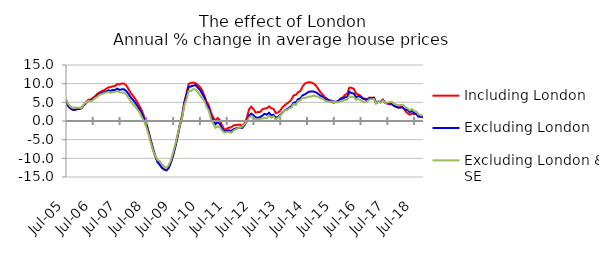
| Category | Including London | Excluding London | Excluding London & SE |
|---|---|---|---|
| 2005-07-01 | 4.929 | 5.234 | 5.912 |
| 2005-08-01 | 3.904 | 4.11 | 4.579 |
| 2005-09-01 | 3.307 | 3.467 | 3.845 |
| 2005-10-01 | 2.983 | 3.057 | 3.504 |
| 2005-11-01 | 2.97 | 3.027 | 3.61 |
| 2005-12-01 | 3.282 | 3.163 | 3.554 |
| 2006-01-01 | 3.392 | 3.23 | 3.526 |
| 2006-02-01 | 3.661 | 3.384 | 3.507 |
| 2006-03-01 | 4.324 | 4.241 | 4.508 |
| 2006-04-01 | 4.937 | 4.745 | 4.889 |
| 2006-05-01 | 5.692 | 5.5 | 5.409 |
| 2006-06-01 | 5.74 | 5.391 | 5.297 |
| 2006-07-01 | 6.189 | 5.833 | 5.562 |
| 2006-08-01 | 6.652 | 6.246 | 6.111 |
| 2006-09-01 | 7.224 | 6.766 | 6.471 |
| 2006-10-01 | 7.66 | 7.279 | 6.993 |
| 2006-11-01 | 7.994 | 7.519 | 7.201 |
| 2006-12-01 | 8.229 | 7.714 | 7.454 |
| 2007-01-01 | 8.608 | 7.898 | 7.611 |
| 2007-02-01 | 9.011 | 8.213 | 7.807 |
| 2007-03-01 | 9.08 | 8.094 | 7.535 |
| 2007-04-01 | 9.295 | 8.304 | 7.716 |
| 2007-05-01 | 9.388 | 8.306 | 7.832 |
| 2007-06-01 | 9.907 | 8.66 | 7.966 |
| 2007-07-01 | 9.788 | 8.343 | 7.697 |
| 2007-08-01 | 10.057 | 8.482 | 7.582 |
| 2007-09-01 | 10.004 | 8.485 | 7.621 |
| 2007-10-01 | 9.547 | 8.05 | 7.097 |
| 2007-11-01 | 8.556 | 7.262 | 6.242 |
| 2007-12-01 | 7.513 | 6.355 | 5.285 |
| 2008-01-01 | 6.804 | 5.702 | 4.489 |
| 2008-02-01 | 5.949 | 4.882 | 3.861 |
| 2008-03-01 | 4.981 | 4.03 | 3.108 |
| 2008-04-01 | 3.926 | 3.04 | 2.268 |
| 2008-05-01 | 2.778 | 1.996 | 1.026 |
| 2008-06-01 | 1.183 | 0.603 | -0.123 |
| 2008-07-01 | -0.603 | -0.964 | -1.66 |
| 2008-08-01 | -2.766 | -3.011 | -3.518 |
| 2008-09-01 | -5.136 | -5.317 | -5.868 |
| 2008-10-01 | -7.399 | -7.61 | -7.927 |
| 2008-11-01 | -9.296 | -9.441 | -9.326 |
| 2008-12-01 | -10.78 | -11.022 | -10.45 |
| 2009-01-01 | -11.611 | -11.692 | -10.714 |
| 2009-02-01 | -12.508 | -12.526 | -11.659 |
| 2009-03-01 | -13.003 | -12.983 | -12.112 |
| 2009-04-01 | -13.206 | -13.181 | -12.62 |
| 2009-05-01 | -12.458 | -12.581 | -11.826 |
| 2009-06-01 | -11.081 | -11.188 | -10.551 |
| 2009-07-01 | -9.049 | -9.241 | -8.491 |
| 2009-08-01 | -6.731 | -6.878 | -6.239 |
| 2009-09-01 | -3.878 | -4.304 | -3.732 |
| 2009-10-01 | -0.95 | -1.35 | -1.078 |
| 2009-11-01 | 1.436 | 0.841 | 0.812 |
| 2009-12-01 | 5.087 | 4.677 | 4.051 |
| 2010-01-01 | 7.476 | 6.847 | 5.855 |
| 2010-02-01 | 9.957 | 9.158 | 8.026 |
| 2010-03-01 | 10.187 | 9.249 | 8.046 |
| 2010-04-01 | 10.293 | 9.464 | 8.539 |
| 2010-05-01 | 10.134 | 9.636 | 8.443 |
| 2010-06-01 | 9.686 | 8.974 | 7.819 |
| 2010-07-01 | 9.13 | 8.344 | 6.927 |
| 2010-08-01 | 8.277 | 7.375 | 6.148 |
| 2010-09-01 | 6.825 | 6.297 | 5.38 |
| 2010-10-01 | 5.198 | 4.562 | 3.81 |
| 2010-11-01 | 4.242 | 3.499 | 2.719 |
| 2010-12-01 | 2.222 | 1.247 | 0.588 |
| 2011-01-01 | 0.939 | 0.042 | -0.777 |
| 2011-02-01 | 0.059 | -0.86 | -1.827 |
| 2011-03-01 | 0.819 | -0.208 | -1.448 |
| 2011-04-01 | 0.169 | -0.876 | -1.735 |
| 2011-05-01 | -1.249 | -2.089 | -2.594 |
| 2011-06-01 | -2.327 | -2.799 | -3.113 |
| 2011-07-01 | -2.111 | -2.68 | -2.984 |
| 2011-08-01 | -1.734 | -2.479 | -2.912 |
| 2011-09-01 | -1.719 | -2.708 | -3.153 |
| 2011-10-01 | -1.214 | -2.257 | -2.603 |
| 2011-11-01 | -1.069 | -1.996 | -2.263 |
| 2011-12-01 | -1.035 | -1.886 | -1.981 |
| 2012-01-01 | -0.955 | -1.72 | -1.646 |
| 2012-02-01 | -1.387 | -1.875 | -1.499 |
| 2012-03-01 | -0.651 | -1.096 | -0.794 |
| 2012-04-01 | 0.731 | -0.125 | -0.376 |
| 2012-05-01 | 3.09 | 1.481 | 0.883 |
| 2012-06-01 | 3.853 | 1.977 | 1.347 |
| 2012-07-01 | 3.236 | 1.571 | 0.934 |
| 2012-08-01 | 2.256 | 0.937 | 0.481 |
| 2012-09-01 | 2.394 | 0.888 | 0.351 |
| 2012-10-01 | 2.437 | 1.034 | 0.539 |
| 2012-11-01 | 3.088 | 1.426 | 0.672 |
| 2012-12-01 | 3.374 | 1.912 | 0.837 |
| 2013-01-01 | 3.401 | 1.699 | 0.715 |
| 2013-02-01 | 3.923 | 2.206 | 1.359 |
| 2013-03-01 | 3.418 | 1.52 | 0.906 |
| 2013-04-01 | 3.278 | 1.644 | 1.225 |
| 2013-05-01 | 2.166 | 0.851 | 0.404 |
| 2013-06-01 | 2.285 | 1.099 | 0.851 |
| 2013-07-01 | 2.753 | 1.602 | 1.473 |
| 2013-08-01 | 3.667 | 2.247 | 2.226 |
| 2013-09-01 | 4.2 | 2.86 | 2.912 |
| 2013-10-01 | 4.672 | 3.129 | 2.875 |
| 2013-11-01 | 5.097 | 3.584 | 3.376 |
| 2013-12-01 | 5.734 | 3.954 | 3.609 |
| 2014-01-01 | 6.843 | 4.907 | 4.542 |
| 2014-02-01 | 6.983 | 4.965 | 4.317 |
| 2014-03-01 | 7.681 | 5.847 | 5.343 |
| 2014-04-01 | 8.001 | 6.044 | 5.45 |
| 2014-05-01 | 9.211 | 6.845 | 6.326 |
| 2014-06-01 | 9.998 | 7.125 | 6.115 |
| 2014-07-01 | 10.284 | 7.494 | 6.334 |
| 2014-08-01 | 10.371 | 7.86 | 6.56 |
| 2014-09-01 | 10.314 | 7.927 | 6.564 |
| 2014-10-01 | 10.032 | 7.894 | 6.813 |
| 2014-11-01 | 9.522 | 7.679 | 6.573 |
| 2014-12-01 | 8.631 | 7.277 | 6.549 |
| 2015-01-01 | 7.731 | 6.813 | 6.058 |
| 2015-02-01 | 7.186 | 6.505 | 6.026 |
| 2015-03-01 | 6.343 | 5.977 | 5.483 |
| 2015-04-01 | 6.022 | 5.732 | 5.304 |
| 2015-05-01 | 5.4 | 5.522 | 5.107 |
| 2015-06-01 | 5.119 | 5.447 | 5.233 |
| 2015-07-01 | 4.895 | 5.208 | 5.134 |
| 2015-08-01 | 5.145 | 5.128 | 5.054 |
| 2015-09-01 | 5.313 | 5.319 | 4.994 |
| 2015-10-01 | 6.033 | 5.873 | 5.273 |
| 2015-11-01 | 6.276 | 5.999 | 5.404 |
| 2015-12-01 | 6.992 | 6.339 | 5.631 |
| 2016-01-01 | 7.254 | 6.427 | 5.715 |
| 2016-02-01 | 8.952 | 7.83 | 6.69 |
| 2016-03-01 | 8.888 | 7.448 | 6.427 |
| 2016-04-01 | 8.591 | 7.359 | 6.427 |
| 2016-05-01 | 7.371 | 6.358 | 5.693 |
| 2016-06-01 | 7.084 | 6.666 | 5.925 |
| 2016-07-01 | 6.779 | 6.463 | 5.632 |
| 2016-08-01 | 6.064 | 6.038 | 5.085 |
| 2016-09-01 | 5.961 | 5.746 | 5.002 |
| 2016-10-01 | 5.857 | 5.668 | 5.238 |
| 2016-11-01 | 6.276 | 6.026 | 5.773 |
| 2016-12-01 | 6.236 | 6.125 | 5.848 |
| 2017-01-01 | 6.236 | 6.241 | 5.865 |
| 2017-02-01 | 4.745 | 4.86 | 4.738 |
| 2017-03-01 | 5.114 | 5.241 | 5.167 |
| 2017-04-01 | 5.081 | 5.01 | 4.907 |
| 2017-05-01 | 5.74 | 5.654 | 5.5 |
| 2017-06-01 | 4.958 | 4.824 | 4.833 |
| 2017-07-01 | 4.719 | 4.729 | 4.942 |
| 2017-08-01 | 4.518 | 4.677 | 5.039 |
| 2017-09-01 | 4.513 | 4.657 | 5.175 |
| 2017-10-01 | 4.058 | 4.065 | 4.6 |
| 2017-11-01 | 3.876 | 3.757 | 4.4 |
| 2017-12-01 | 3.849 | 3.538 | 4.181 |
| 2018-01-01 | 3.838 | 3.585 | 4.291 |
| 2018-02-01 | 3.65 | 3.663 | 4.35 |
| 2018-03-01 | 2.772 | 3.097 | 3.689 |
| 2018-04-01 | 2.096 | 2.954 | 3.46 |
| 2018-05-01 | 1.705 | 2.378 | 2.875 |
| 2018-06-01 | 1.995 | 2.692 | 3.199 |
| 2018-07-01 | 1.848 | 2.151 | 2.734 |
| 2018-08-01 | 1.855 | 1.938 | 2.517 |
| 2018-09-01 | 1.161 | 1.284 | 1.763 |
| 2018-10-01 | 1.116 | 1.22 | 1.558 |
| 2018-11-01 | 0.9 | 1.174 | 1.455 |